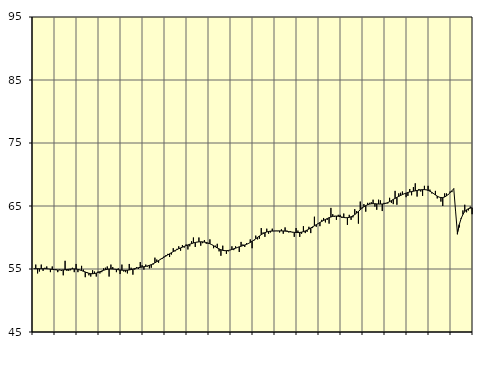
| Category | Samtliga sysselsatta (inkl. sysselsatta utomlands) | Series 1 |
|---|---|---|
| nan | 55.1 | 55.04 |
| 1.0 | 55.7 | 55.04 |
| 1.0 | 54.3 | 55.05 |
| 1.0 | 54.6 | 55.04 |
| 1.0 | 55.7 | 55.04 |
| 1.0 | 54.7 | 55.04 |
| 1.0 | 55.2 | 55.05 |
| 1.0 | 55.4 | 55.03 |
| 1.0 | 55 | 55.01 |
| 1.0 | 54.5 | 54.98 |
| 1.0 | 55.4 | 54.94 |
| 1.0 | 54.9 | 54.91 |
| nan | 55 | 54.87 |
| 2.0 | 54.5 | 54.85 |
| 2.0 | 54.9 | 54.84 |
| 2.0 | 54.7 | 54.84 |
| 2.0 | 54 | 54.86 |
| 2.0 | 56.3 | 54.88 |
| 2.0 | 54.7 | 54.92 |
| 2.0 | 54.7 | 54.96 |
| 2.0 | 54.8 | 55 |
| 2.0 | 55.2 | 55.02 |
| 2.0 | 54.5 | 55.02 |
| 2.0 | 55.8 | 54.99 |
| nan | 54.5 | 54.93 |
| 3.0 | 54.9 | 54.85 |
| 3.0 | 55.5 | 54.75 |
| 3.0 | 54.9 | 54.64 |
| 3.0 | 53.7 | 54.53 |
| 3.0 | 54.5 | 54.41 |
| 3.0 | 54 | 54.32 |
| 3.0 | 53.8 | 54.26 |
| 3.0 | 54.8 | 54.25 |
| 3.0 | 54.6 | 54.28 |
| 3.0 | 53.8 | 54.35 |
| 3.0 | 54.6 | 54.45 |
| nan | 54.3 | 54.57 |
| 4.0 | 54.5 | 54.69 |
| 4.0 | 55.1 | 54.8 |
| 4.0 | 55.2 | 54.89 |
| 4.0 | 55.4 | 54.95 |
| 4.0 | 53.8 | 55 |
| 4.0 | 55.7 | 55.01 |
| 4.0 | 55.3 | 54.99 |
| 4.0 | 55 | 54.97 |
| 4.0 | 54.5 | 54.93 |
| 4.0 | 55.1 | 54.88 |
| 4.0 | 54.2 | 54.85 |
| nan | 55.7 | 54.81 |
| 5.0 | 54.6 | 54.8 |
| 5.0 | 54.5 | 54.79 |
| 5.0 | 54.3 | 54.81 |
| 5.0 | 55.8 | 54.85 |
| 5.0 | 55.2 | 54.91 |
| 5.0 | 54.1 | 54.99 |
| 5.0 | 54.9 | 55.07 |
| 5.0 | 55.3 | 55.14 |
| 5.0 | 55 | 55.2 |
| 5.0 | 56.1 | 55.26 |
| 5.0 | 55.6 | 55.31 |
| nan | 54.9 | 55.36 |
| 6.0 | 55.7 | 55.42 |
| 6.0 | 55.4 | 55.49 |
| 6.0 | 55.1 | 55.58 |
| 6.0 | 55.2 | 55.69 |
| 6.0 | 55.7 | 55.83 |
| 6.0 | 56.8 | 55.98 |
| 6.0 | 56.5 | 56.16 |
| 6.0 | 56 | 56.34 |
| 6.0 | 56.6 | 56.53 |
| 6.0 | 56.6 | 56.71 |
| 6.0 | 57 | 56.88 |
| nan | 57.2 | 57.05 |
| 7.0 | 57.4 | 57.23 |
| 7.0 | 56.9 | 57.41 |
| 7.0 | 57.3 | 57.59 |
| 7.0 | 58.3 | 57.76 |
| 7.0 | 57.8 | 57.93 |
| 7.0 | 58.2 | 58.08 |
| 7.0 | 58.6 | 58.22 |
| 7.0 | 57.9 | 58.34 |
| 7.0 | 58.8 | 58.47 |
| 7.0 | 58.4 | 58.59 |
| 7.0 | 58.9 | 58.71 |
| nan | 58.1 | 58.82 |
| 8.0 | 58.6 | 58.93 |
| 8.0 | 59.4 | 59.03 |
| 8.0 | 60 | 59.13 |
| 8.0 | 58.5 | 59.21 |
| 8.0 | 59.3 | 59.27 |
| 8.0 | 60 | 59.31 |
| 8.0 | 58.7 | 59.32 |
| 8.0 | 59.1 | 59.31 |
| 8.0 | 59.6 | 59.27 |
| 8.0 | 59 | 59.21 |
| 8.0 | 59 | 59.12 |
| nan | 59.7 | 59 |
| 9.0 | 58.9 | 58.86 |
| 9.0 | 58.3 | 58.7 |
| 9.0 | 58.7 | 58.52 |
| 9.0 | 59 | 58.34 |
| 9.0 | 57.8 | 58.19 |
| 9.0 | 57.1 | 58.06 |
| 9.0 | 58.7 | 57.96 |
| 9.0 | 58 | 57.91 |
| 9.0 | 57.4 | 57.91 |
| 9.0 | 57.8 | 57.94 |
| 9.0 | 58 | 58.01 |
| nan | 58.6 | 58.1 |
| 10.0 | 58 | 58.2 |
| 10.0 | 58.6 | 58.31 |
| 10.0 | 58.4 | 58.42 |
| 10.0 | 57.7 | 58.52 |
| 10.0 | 59.3 | 58.62 |
| 10.0 | 58.9 | 58.71 |
| 10.0 | 58.5 | 58.81 |
| 10.0 | 59.1 | 58.92 |
| 10.0 | 59.1 | 59.05 |
| 10.0 | 59.7 | 59.21 |
| 10.0 | 58.3 | 59.4 |
| nan | 59.5 | 59.59 |
| 11.0 | 60.3 | 59.8 |
| 11.0 | 59.7 | 60.02 |
| 11.0 | 59.8 | 60.24 |
| 11.0 | 61.5 | 60.45 |
| 11.0 | 60.8 | 60.63 |
| 11.0 | 60.1 | 60.77 |
| 11.0 | 61.4 | 60.88 |
| 11.0 | 60.6 | 60.95 |
| 11.0 | 60.8 | 61 |
| 11.0 | 61.4 | 61.02 |
| 11.0 | 61 | 61.04 |
| nan | 61 | 61.05 |
| 12.0 | 61 | 61.05 |
| 12.0 | 60.8 | 61.05 |
| 12.0 | 61.3 | 61.05 |
| 12.0 | 60.6 | 61.04 |
| 12.0 | 61.6 | 61.01 |
| 12.0 | 61.1 | 60.98 |
| 12.0 | 60.8 | 60.94 |
| 12.0 | 61 | 60.89 |
| 12.0 | 60.8 | 60.86 |
| 12.0 | 60.1 | 60.82 |
| 12.0 | 61.5 | 60.8 |
| nan | 61.1 | 60.78 |
| 13.0 | 60.1 | 60.8 |
| 13.0 | 60.6 | 60.85 |
| 13.0 | 61.8 | 60.93 |
| 13.0 | 60.7 | 61.04 |
| 13.0 | 60.9 | 61.18 |
| 13.0 | 61.7 | 61.34 |
| 13.0 | 60.7 | 61.51 |
| 13.0 | 61.5 | 61.69 |
| 13.0 | 63.3 | 61.86 |
| 13.0 | 61.7 | 62.03 |
| 13.0 | 62.2 | 62.21 |
| nan | 61.8 | 62.38 |
| 14.0 | 62.8 | 62.55 |
| 14.0 | 63.1 | 62.71 |
| 14.0 | 62.4 | 62.86 |
| 14.0 | 62.8 | 63.01 |
| 14.0 | 62.2 | 63.14 |
| 14.0 | 64.7 | 63.26 |
| 14.0 | 63.7 | 63.35 |
| 14.0 | 63.3 | 63.4 |
| 14.0 | 62.8 | 63.4 |
| 14.0 | 63.6 | 63.37 |
| 14.0 | 63.6 | 63.32 |
| nan | 63.1 | 63.25 |
| 15.0 | 63.8 | 63.18 |
| 15.0 | 63.1 | 63.14 |
| 15.0 | 62 | 63.14 |
| 15.0 | 63.6 | 63.19 |
| 15.0 | 62.8 | 63.29 |
| 15.0 | 63.2 | 63.44 |
| 15.0 | 64.5 | 63.64 |
| 15.0 | 64.2 | 63.87 |
| 15.0 | 62.2 | 64.13 |
| 15.0 | 65.7 | 64.4 |
| 15.0 | 64.8 | 64.65 |
| nan | 65.3 | 64.88 |
| 16.0 | 64.1 | 65.06 |
| 16.0 | 65.5 | 65.2 |
| 16.0 | 65.5 | 65.3 |
| 16.0 | 65.6 | 65.35 |
| 16.0 | 66 | 65.37 |
| 16.0 | 64.9 | 65.36 |
| 16.0 | 64.4 | 65.34 |
| 16.0 | 66 | 65.31 |
| 16.0 | 65.9 | 65.31 |
| 16.0 | 64.2 | 65.32 |
| 16.0 | 65.5 | 65.35 |
| nan | 65.5 | 65.42 |
| 17.0 | 65.4 | 65.54 |
| 17.0 | 66.3 | 65.69 |
| 17.0 | 65.5 | 65.86 |
| 17.0 | 65.3 | 66.04 |
| 17.0 | 67.4 | 66.21 |
| 17.0 | 65.2 | 66.37 |
| 17.0 | 67 | 66.53 |
| 17.0 | 67.1 | 66.67 |
| 17.0 | 67.3 | 66.81 |
| 17.0 | 66.9 | 66.94 |
| 17.0 | 66.4 | 67.05 |
| nan | 66.6 | 67.15 |
| 18.0 | 67.7 | 67.22 |
| 18.0 | 66.7 | 67.29 |
| 18.0 | 68 | 67.35 |
| 18.0 | 68.6 | 67.41 |
| 18.0 | 66.5 | 67.46 |
| 18.0 | 67.7 | 67.52 |
| 18.0 | 67.3 | 67.57 |
| 18.0 | 66.6 | 67.6 |
| 18.0 | 68.2 | 67.6 |
| 18.0 | 67.6 | 67.56 |
| 18.0 | 68.2 | 67.48 |
| nan | 67.6 | 67.35 |
| 19.0 | 67 | 67.17 |
| 19.0 | 66.9 | 66.97 |
| 19.0 | 67.4 | 66.76 |
| 19.0 | 66.2 | 66.56 |
| 19.0 | 66.4 | 66.41 |
| 19.0 | 65.7 | 66.34 |
| 19.0 | 65 | 66.34 |
| 19.0 | 67 | 66.43 |
| 19.0 | 67 | 66.6 |
| 19.0 | 66.9 | 66.83 |
| 19.0 | 67.3 | 67.11 |
| nan | 67.2 | 67.42 |
| 20.0 | 67.8 | 67.75 |
| 20.0 | 64.2 | 64.17 |
| 20.0 | 60.5 | 60.69 |
| 20.0 | 61.6 | 62.04 |
| 20.0 | 63.1 | 62.99 |
| 20.0 | 64.3 | 63.66 |
| 20.0 | 65.2 | 64.11 |
| 20.0 | 64 | 64.4 |
| 20.0 | 64.3 | 64.57 |
| 20.0 | 64.9 | 64.66 |
| 20.0 | 63.7 | 64.72 |